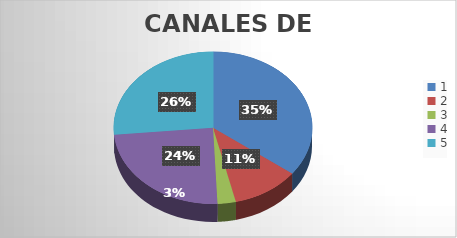
| Category | Series 0 |
|---|---|
| 0 | 320 |
| 1 | 100 |
| 2 | 27 |
| 3 | 220 |
| 4 | 240 |